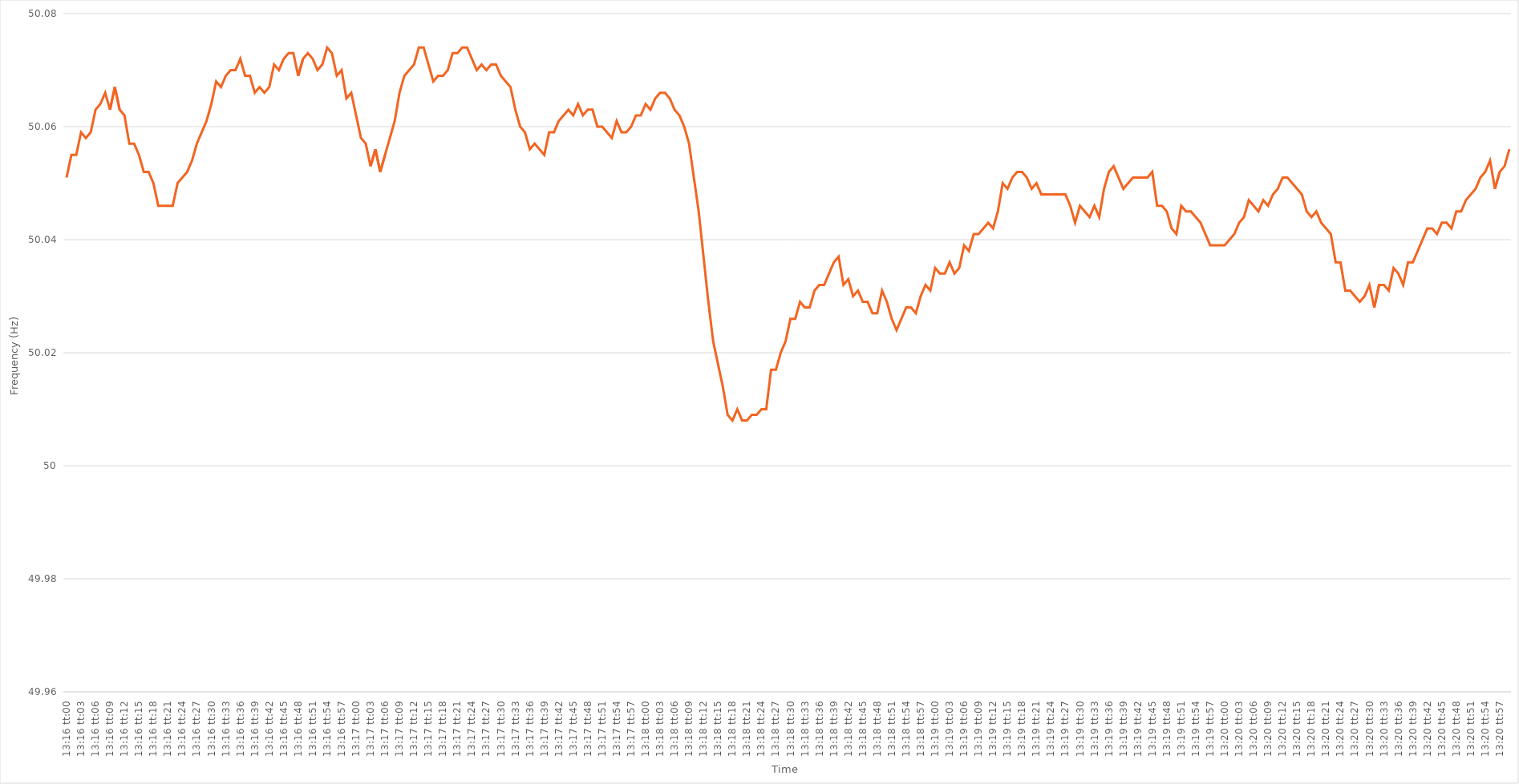
| Category | Series 0 |
|---|---|
| 0.5527777777777778 | 50.051 |
| 0.5527893518518519 | 50.055 |
| 0.552800925925926 | 50.055 |
| 0.5528125 | 50.059 |
| 0.5528240740740741 | 50.058 |
| 0.5528356481481481 | 50.059 |
| 0.5528472222222222 | 50.063 |
| 0.5528587962962963 | 50.064 |
| 0.5528703703703703 | 50.066 |
| 0.5528819444444445 | 50.063 |
| 0.5528935185185185 | 50.067 |
| 0.5529050925925926 | 50.063 |
| 0.5529166666666666 | 50.062 |
| 0.5529282407407408 | 50.057 |
| 0.5529398148148148 | 50.057 |
| 0.552951388888889 | 50.055 |
| 0.552962962962963 | 50.052 |
| 0.552974537037037 | 50.052 |
| 0.5529861111111111 | 50.05 |
| 0.5529976851851852 | 50.046 |
| 0.5530092592592593 | 50.046 |
| 0.5530208333333334 | 50.046 |
| 0.5530324074074074 | 50.046 |
| 0.5530439814814815 | 50.05 |
| 0.5530555555555555 | 50.051 |
| 0.5530671296296296 | 50.052 |
| 0.5530787037037037 | 50.054 |
| 0.5530902777777778 | 50.057 |
| 0.5531018518518519 | 50.059 |
| 0.5531134259259259 | 50.061 |
| 0.553125 | 50.064 |
| 0.553136574074074 | 50.068 |
| 0.5531481481481482 | 50.067 |
| 0.5531597222222222 | 50.069 |
| 0.5531712962962964 | 50.07 |
| 0.5531828703703704 | 50.07 |
| 0.5531944444444444 | 50.072 |
| 0.5532060185185185 | 50.069 |
| 0.5532175925925926 | 50.069 |
| 0.5532291666666667 | 50.066 |
| 0.5532407407407408 | 50.067 |
| 0.5532523148148148 | 50.066 |
| 0.5532638888888889 | 50.067 |
| 0.5532754629629629 | 50.071 |
| 0.553287037037037 | 50.07 |
| 0.5532986111111111 | 50.072 |
| 0.5533101851851852 | 50.073 |
| 0.5533217592592593 | 50.073 |
| 0.5533333333333333 | 50.069 |
| 0.5533449074074074 | 50.072 |
| 0.5533564814814814 | 50.073 |
| 0.5533680555555556 | 50.072 |
| 0.5533796296296296 | 50.07 |
| 0.5533912037037038 | 50.071 |
| 0.5534027777777778 | 50.074 |
| 0.5534143518518518 | 50.073 |
| 0.5534259259259259 | 50.069 |
| 0.5534375 | 50.07 |
| 0.5534490740740741 | 50.065 |
| 0.5534606481481482 | 50.066 |
| 0.5534722222222223 | 50.062 |
| 0.5534837962962963 | 50.058 |
| 0.5534953703703703 | 50.057 |
| 0.5535069444444445 | 50.053 |
| 0.5535185185185185 | 50.056 |
| 0.5535300925925926 | 50.052 |
| 0.5535416666666667 | 50.055 |
| 0.5535532407407407 | 50.058 |
| 0.5535648148148148 | 50.061 |
| 0.5535763888888888 | 50.066 |
| 0.553587962962963 | 50.069 |
| 0.553599537037037 | 50.07 |
| 0.5536111111111112 | 50.071 |
| 0.5536226851851852 | 50.074 |
| 0.5536342592592592 | 50.074 |
| 0.5536458333333333 | 50.071 |
| 0.5536574074074074 | 50.068 |
| 0.5536689814814815 | 50.069 |
| 0.5536805555555556 | 50.069 |
| 0.5536921296296297 | 50.07 |
| 0.5537037037037037 | 50.073 |
| 0.5537152777777777 | 50.073 |
| 0.5537268518518519 | 50.074 |
| 0.5537384259259259 | 50.074 |
| 0.55375 | 50.072 |
| 0.5537615740740741 | 50.07 |
| 0.5537731481481482 | 50.071 |
| 0.5537847222222222 | 50.07 |
| 0.5537962962962962 | 50.071 |
| 0.5538078703703704 | 50.071 |
| 0.5538194444444444 | 50.069 |
| 0.5538310185185186 | 50.068 |
| 0.5538425925925926 | 50.067 |
| 0.5538541666666666 | 50.063 |
| 0.5538657407407407 | 50.06 |
| 0.5538773148148148 | 50.059 |
| 0.5538888888888889 | 50.056 |
| 0.553900462962963 | 50.057 |
| 0.5539120370370371 | 50.056 |
| 0.5539236111111111 | 50.055 |
| 0.5539351851851851 | 50.059 |
| 0.5539467592592593 | 50.059 |
| 0.5539583333333333 | 50.061 |
| 0.5539699074074074 | 50.062 |
| 0.5539814814814815 | 50.063 |
| 0.5539930555555556 | 50.062 |
| 0.5540046296296296 | 50.064 |
| 0.5540162037037036 | 50.062 |
| 0.5540277777777778 | 50.063 |
| 0.5540393518518518 | 50.063 |
| 0.554050925925926 | 50.06 |
| 0.5540625 | 50.06 |
| 0.554074074074074 | 50.059 |
| 0.5540856481481481 | 50.058 |
| 0.5540972222222222 | 50.061 |
| 0.5541087962962963 | 50.059 |
| 0.5541203703703704 | 50.059 |
| 0.5541319444444445 | 50.06 |
| 0.5541435185185185 | 50.062 |
| 0.5541550925925925 | 50.062 |
| 0.5541666666666667 | 50.064 |
| 0.5541782407407407 | 50.063 |
| 0.5541898148148149 | 50.065 |
| 0.5542013888888889 | 50.066 |
| 0.554212962962963 | 50.066 |
| 0.554224537037037 | 50.065 |
| 0.554236111111111 | 50.063 |
| 0.5542476851851852 | 50.062 |
| 0.5542592592592592 | 50.06 |
| 0.5542708333333334 | 50.057 |
| 0.5542824074074074 | 50.051 |
| 0.5542939814814815 | 50.045 |
| 0.5543055555555555 | 50.037 |
| 0.5543171296296296 | 50.029 |
| 0.5543287037037037 | 50.022 |
| 0.5543402777777778 | 50.018 |
| 0.5543518518518519 | 50.014 |
| 0.5543634259259259 | 50.009 |
| 0.554375 | 50.008 |
| 0.5543865740740741 | 50.01 |
| 0.5543981481481481 | 50.008 |
| 0.5544097222222223 | 50.008 |
| 0.5544212962962963 | 50.009 |
| 0.5544328703703704 | 50.009 |
| 0.5544444444444444 | 50.01 |
| 0.5544560185185184 | 50.01 |
| 0.5544675925925926 | 50.017 |
| 0.5544791666666666 | 50.017 |
| 0.5544907407407408 | 50.02 |
| 0.5545023148148148 | 50.022 |
| 0.5545138888888889 | 50.026 |
| 0.5545254629629629 | 50.026 |
| 0.554537037037037 | 50.029 |
| 0.5545486111111111 | 50.028 |
| 0.5545601851851852 | 50.028 |
| 0.5545717592592593 | 50.031 |
| 0.5545833333333333 | 50.032 |
| 0.5545949074074074 | 50.032 |
| 0.5546064814814815 | 50.034 |
| 0.5546180555555555 | 50.036 |
| 0.5546296296296297 | 50.037 |
| 0.5546412037037037 | 50.032 |
| 0.5546527777777778 | 50.033 |
| 0.5546643518518518 | 50.03 |
| 0.554675925925926 | 50.031 |
| 0.5546875 | 50.029 |
| 0.554699074074074 | 50.029 |
| 0.5547106481481482 | 50.027 |
| 0.5547222222222222 | 50.027 |
| 0.5547337962962963 | 50.031 |
| 0.5547453703703703 | 50.029 |
| 0.5547569444444445 | 50.026 |
| 0.5547685185185185 | 50.024 |
| 0.5547800925925926 | 50.026 |
| 0.5547916666666667 | 50.028 |
| 0.5548032407407407 | 50.028 |
| 0.5548148148148148 | 50.027 |
| 0.5548263888888889 | 50.03 |
| 0.554837962962963 | 50.032 |
| 0.5548495370370371 | 50.031 |
| 0.5548611111111111 | 50.035 |
| 0.5548726851851852 | 50.034 |
| 0.5548842592592592 | 50.034 |
| 0.5548958333333334 | 50.036 |
| 0.5549074074074074 | 50.034 |
| 0.5549189814814816 | 50.035 |
| 0.5549305555555556 | 50.039 |
| 0.5549421296296296 | 50.038 |
| 0.5549537037037037 | 50.041 |
| 0.5549652777777777 | 50.041 |
| 0.5549768518518519 | 50.042 |
| 0.5549884259259259 | 50.043 |
| 0.555 | 50.042 |
| 0.5550115740740741 | 50.045 |
| 0.5550231481481481 | 50.05 |
| 0.5550347222222222 | 50.049 |
| 0.5550462962962963 | 50.051 |
| 0.5550578703703704 | 50.052 |
| 0.5550694444444445 | 50.052 |
| 0.5550810185185185 | 50.051 |
| 0.5550925925925926 | 50.049 |
| 0.5551041666666666 | 50.05 |
| 0.5551157407407408 | 50.048 |
| 0.5551273148148148 | 50.048 |
| 0.555138888888889 | 50.048 |
| 0.555150462962963 | 50.048 |
| 0.555162037037037 | 50.048 |
| 0.5551736111111111 | 50.048 |
| 0.5551851851851851 | 50.046 |
| 0.5551967592592593 | 50.043 |
| 0.5552083333333333 | 50.046 |
| 0.5552199074074075 | 50.045 |
| 0.5552314814814815 | 50.044 |
| 0.5552430555555555 | 50.046 |
| 0.5552546296296296 | 50.044 |
| 0.5552662037037037 | 50.049 |
| 0.5552777777777778 | 50.052 |
| 0.5552893518518519 | 50.053 |
| 0.555300925925926 | 50.051 |
| 0.5553125 | 50.049 |
| 0.555324074074074 | 50.05 |
| 0.5553356481481482 | 50.051 |
| 0.5553472222222222 | 50.051 |
| 0.5553587962962964 | 50.051 |
| 0.5553703703703704 | 50.051 |
| 0.5553819444444444 | 50.052 |
| 0.5553935185185185 | 50.046 |
| 0.5554050925925926 | 50.046 |
| 0.5554166666666667 | 50.045 |
| 0.5554282407407407 | 50.042 |
| 0.5554398148148149 | 50.041 |
| 0.5554513888888889 | 50.046 |
| 0.5554629629629629 | 50.045 |
| 0.555474537037037 | 50.045 |
| 0.5554861111111111 | 50.044 |
| 0.5554976851851852 | 50.043 |
| 0.5555092592592593 | 50.041 |
| 0.5555208333333334 | 50.039 |
| 0.5555324074074074 | 50.039 |
| 0.5555439814814814 | 50.039 |
| 0.5555555555555556 | 50.039 |
| 0.5555671296296296 | 50.04 |
| 0.5555787037037038 | 50.041 |
| 0.5555902777777778 | 50.043 |
| 0.5556018518518518 | 50.044 |
| 0.5556134259259259 | 50.047 |
| 0.555625 | 50.046 |
| 0.5556365740740741 | 50.045 |
| 0.5556481481481481 | 50.047 |
| 0.5556597222222223 | 50.046 |
| 0.5556712962962963 | 50.048 |
| 0.5556828703703703 | 50.049 |
| 0.5556944444444444 | 50.051 |
| 0.5557060185185185 | 50.051 |
| 0.5557175925925926 | 50.05 |
| 0.5557291666666667 | 50.049 |
| 0.5557407407407408 | 50.048 |
| 0.5557523148148148 | 50.045 |
| 0.5557638888888888 | 50.044 |
| 0.555775462962963 | 50.045 |
| 0.555787037037037 | 50.043 |
| 0.5557986111111112 | 50.042 |
| 0.5558101851851852 | 50.041 |
| 0.5558217592592593 | 50.036 |
| 0.5558333333333333 | 50.036 |
| 0.5558449074074074 | 50.031 |
| 0.5558564814814815 | 50.031 |
| 0.5558680555555555 | 50.03 |
| 0.5558796296296297 | 50.029 |
| 0.5558912037037037 | 50.03 |
| 0.5559027777777777 | 50.032 |
| 0.5559143518518518 | 50.028 |
| 0.5559259259259259 | 50.032 |
| 0.5559375 | 50.032 |
| 0.5559490740740741 | 50.031 |
| 0.5559606481481482 | 50.035 |
| 0.5559722222222222 | 50.034 |
| 0.5559837962962962 | 50.032 |
| 0.5559953703703704 | 50.036 |
| 0.5560069444444444 | 50.036 |
| 0.5560185185185186 | 50.038 |
| 0.5560300925925926 | 50.04 |
| 0.5560416666666667 | 50.042 |
| 0.5560532407407407 | 50.042 |
| 0.5560648148148148 | 50.041 |
| 0.5560763888888889 | 50.043 |
| 0.556087962962963 | 50.043 |
| 0.5560995370370371 | 50.042 |
| 0.5561111111111111 | 50.045 |
| 0.5561226851851852 | 50.045 |
| 0.5561342592592592 | 50.047 |
| 0.5561458333333333 | 50.048 |
| 0.5561574074074074 | 50.049 |
| 0.5561689814814815 | 50.051 |
| 0.5561805555555556 | 50.052 |
| 0.5561921296296296 | 50.054 |
| 0.5562037037037036 | 50.049 |
| 0.5562152777777778 | 50.052 |
| 0.5562268518518518 | 50.053 |
| 0.556238425925926 | 50.056 |